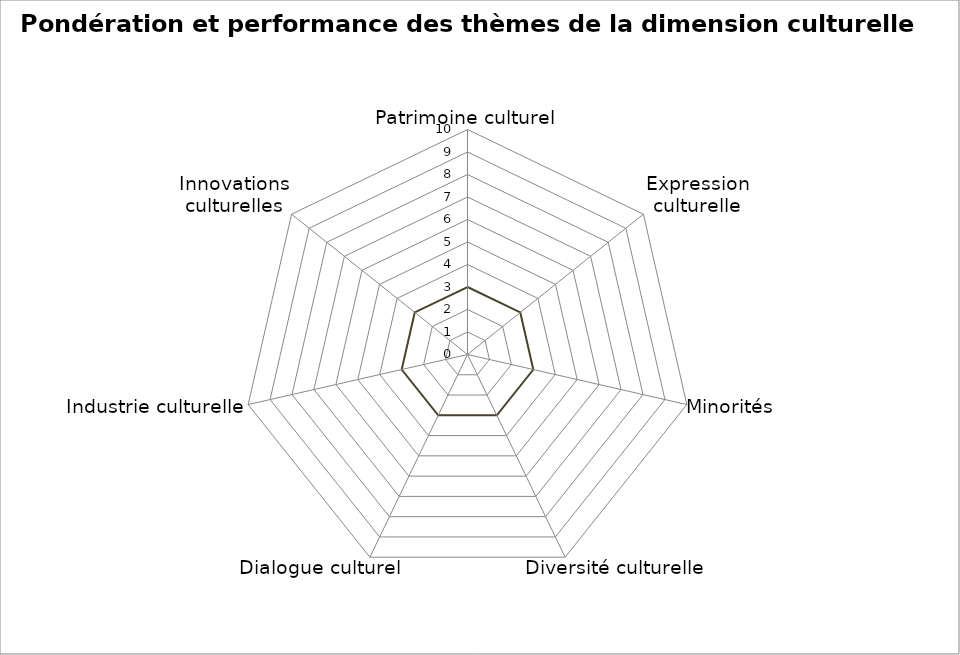
| Category | Performance | Pondération | Series 2 |
|---|---|---|---|
| Patrimoine culturel | 0 | 0 | 3 |
| Expression culturelle | 0 | 0 | 3 |
| Minorités | 0 | 0 | 3 |
| Diversité culturelle | 0 | 0 | 3 |
| Dialogue culturel | 0 | 0 | 3 |
| Industrie culturelle | 0 | 0 | 3 |
| Innovations culturelles | 0 | 0 | 3 |